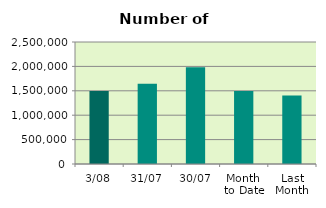
| Category | Series 0 |
|---|---|
| 3/08 | 1496938 |
| 31/07 | 1646042 |
| 30/07 | 1983212 |
| Month 
to Date | 1496938 |
| Last
Month | 1404253.739 |